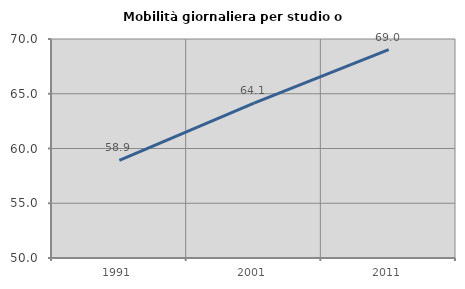
| Category | Mobilità giornaliera per studio o lavoro |
|---|---|
| 1991.0 | 58.925 |
| 2001.0 | 64.136 |
| 2011.0 | 69.034 |